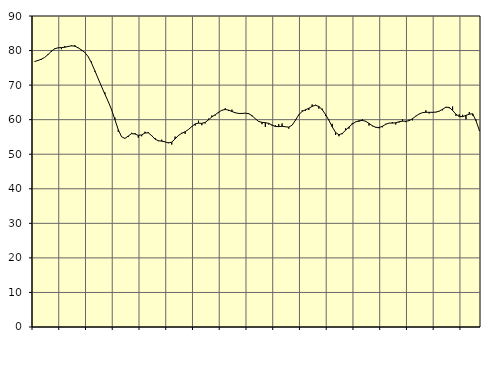
| Category | Piggar | Series 1 |
|---|---|---|
| nan | 76.9 | 76.83 |
| 87.0 | 77.1 | 77.13 |
| 87.0 | 77.3 | 77.5 |
| 87.0 | 78 | 78.01 |
| nan | 79 | 78.84 |
| 88.0 | 79.6 | 79.8 |
| 88.0 | 80.6 | 80.5 |
| 88.0 | 80.8 | 80.8 |
| nan | 80.4 | 80.86 |
| 89.0 | 81.3 | 80.95 |
| 89.0 | 81.1 | 81.18 |
| 89.0 | 81.5 | 81.36 |
| nan | 81.6 | 81.27 |
| 90.0 | 80.7 | 80.8 |
| 90.0 | 79.9 | 80.17 |
| 90.0 | 79.4 | 79.45 |
| nan | 78.3 | 78.25 |
| 91.0 | 76.8 | 76.39 |
| 91.0 | 73.9 | 74.16 |
| 91.0 | 71.9 | 71.86 |
| nan | 69.7 | 69.59 |
| 92.0 | 67.9 | 67.37 |
| 92.0 | 65.2 | 65.24 |
| 92.0 | 63.1 | 62.89 |
| nan | 60.6 | 60.02 |
| 93.0 | 56.5 | 57.1 |
| 93.0 | 55 | 55.03 |
| 93.0 | 54.5 | 54.56 |
| nan | 55 | 55.28 |
| 94.0 | 56.2 | 55.96 |
| 94.0 | 56.1 | 55.86 |
| 94.0 | 54.8 | 55.44 |
| nan | 55.2 | 55.59 |
| 95.0 | 56.5 | 56.15 |
| 95.0 | 56.4 | 56.19 |
| 95.0 | 55.5 | 55.36 |
| nan | 54.7 | 54.37 |
| 96.0 | 53.8 | 53.9 |
| 96.0 | 54.2 | 53.79 |
| 96.0 | 53.6 | 53.57 |
| nan | 53.4 | 53.26 |
| 97.0 | 52.8 | 53.49 |
| 97.0 | 55.1 | 54.42 |
| 97.0 | 55.5 | 55.43 |
| nan | 56.2 | 56.05 |
| 98.0 | 55.9 | 56.51 |
| 98.0 | 57.2 | 57.16 |
| 98.0 | 58.1 | 58 |
| nan | 58.3 | 58.78 |
| 99.0 | 59.7 | 58.99 |
| 99.0 | 58.4 | 58.94 |
| 99.0 | 58.9 | 59.2 |
| nan | 60.3 | 59.95 |
| 0.0 | 61.2 | 60.8 |
| 0.0 | 61.2 | 61.42 |
| 0.0 | 61.9 | 62.13 |
| nan | 62.8 | 62.73 |
| 1.0 | 63.3 | 62.94 |
| 1.0 | 62.5 | 62.77 |
| 1.0 | 62.9 | 62.37 |
| nan | 62.1 | 62 |
| 2.0 | 61.9 | 61.8 |
| 2.0 | 61.8 | 61.8 |
| 2.0 | 61.9 | 61.88 |
| nan | 61.9 | 61.73 |
| 3.0 | 61 | 61.17 |
| 3.0 | 60.3 | 60.26 |
| 3.0 | 59.4 | 59.5 |
| nan | 58.7 | 59.22 |
| 4.0 | 57.9 | 59.13 |
| 4.0 | 58.6 | 58.92 |
| 4.0 | 58.3 | 58.45 |
| nan | 58.4 | 58.02 |
| 5.0 | 58.7 | 57.99 |
| 5.0 | 58.9 | 58.09 |
| 5.0 | 58 | 57.95 |
| nan | 57.4 | 57.83 |
| 6.0 | 58.4 | 58.41 |
| 6.0 | 60 | 59.82 |
| 6.0 | 61.5 | 61.41 |
| nan | 62.7 | 62.4 |
| 7.0 | 62.5 | 62.87 |
| 7.0 | 62.8 | 63.3 |
| 7.0 | 64.4 | 63.85 |
| nan | 64.3 | 64.17 |
| 8.0 | 63.2 | 63.82 |
| 8.0 | 63.2 | 62.88 |
| 8.0 | 61.1 | 61.5 |
| nan | 60 | 59.83 |
| 9.0 | 58.8 | 57.93 |
| 9.0 | 55.6 | 56.31 |
| 9.0 | 55.2 | 55.62 |
| nan | 55.8 | 56.01 |
| 10.0 | 57.5 | 56.93 |
| 10.0 | 57.4 | 57.91 |
| 10.0 | 59 | 58.72 |
| nan | 59.4 | 59.34 |
| 11.0 | 59.4 | 59.68 |
| 11.0 | 60.1 | 59.77 |
| 11.0 | 59.6 | 59.54 |
| nan | 58.3 | 58.92 |
| 12.0 | 58.1 | 58.24 |
| 12.0 | 57.9 | 57.79 |
| 12.0 | 57.5 | 57.73 |
| nan | 57.8 | 58.07 |
| 13.0 | 58.8 | 58.66 |
| 13.0 | 59 | 59.01 |
| 13.0 | 59.3 | 59 |
| nan | 58.6 | 59.11 |
| 14.0 | 59.2 | 59.39 |
| 14.0 | 60.1 | 59.57 |
| 14.0 | 59.3 | 59.55 |
| nan | 60 | 59.7 |
| 15.0 | 59.8 | 60.27 |
| 15.0 | 61.1 | 61 |
| 15.0 | 61.6 | 61.65 |
| nan | 62 | 62.04 |
| 16.0 | 62.7 | 62.14 |
| 16.0 | 61.8 | 62.13 |
| 16.0 | 62 | 62.13 |
| nan | 62.1 | 62.2 |
| 17.0 | 62.4 | 62.47 |
| 17.0 | 62.7 | 63.01 |
| 17.0 | 63.7 | 63.59 |
| nan | 63.3 | 63.55 |
| 18.0 | 63.8 | 62.68 |
| 18.0 | 61.1 | 61.59 |
| 18.0 | 61.5 | 60.91 |
| nan | 61.4 | 60.88 |
| 19.0 | 60.1 | 61.24 |
| 19.0 | 62.2 | 61.59 |
| 19.0 | 61.2 | 61.7 |
| nan | 60 | 59.69 |
| 20.0 | 56.7 | 56.94 |